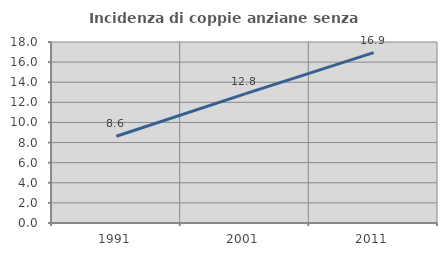
| Category | Incidenza di coppie anziane senza figli  |
|---|---|
| 1991.0 | 8.622 |
| 2001.0 | 12.843 |
| 2011.0 | 16.95 |